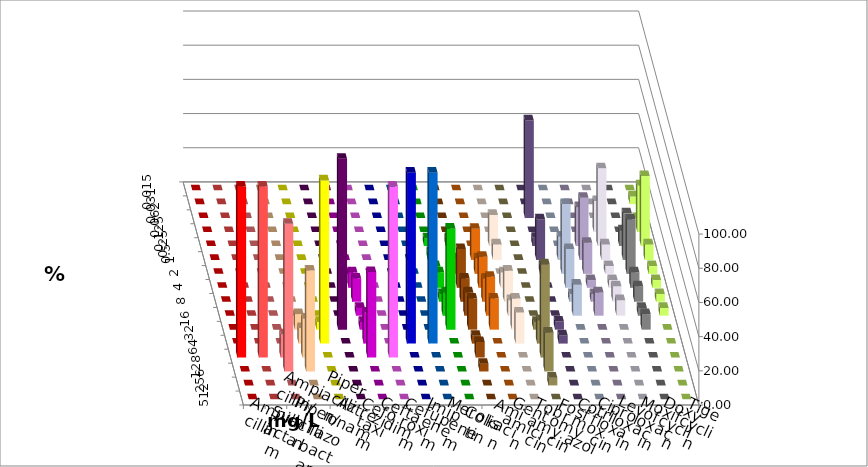
| Category | Ampicillin | Ampicillin/ Sulbactam | Piperacillin | Piperacillin/ Tazobactam | Aztreonam | Cefotaxim | Ceftazidim | Cefuroxim | Imipenem | Meropenem | Colistin | Amikacin | Gentamicin | Tobramycin | Fosfomycin | Cotrimoxazol | Ciprofloxacin | Levofloxacin | Moxifloxacin | Doxycyclin | Tigecyclin |
|---|---|---|---|---|---|---|---|---|---|---|---|---|---|---|---|---|---|---|---|---|---|
| 0.015 | 0 | 0 | 0 | 0 | 0 | 0 | 0 | 0 | 0 | 0 | 0 | 0 | 0 | 0 | 0 | 0 | 0 | 0 | 0 | 0 | 0 |
| 0.031 | 0 | 0 | 0 | 0 | 0 | 0 | 0 | 0 | 0 | 0 | 0 | 0 | 0 | 0 | 0 | 0 | 0 | 0 | 0 | 0 | 4.545 |
| 0.062 | 0 | 0 | 0 | 0 | 0 | 0 | 0 | 0 | 0 | 0 | 0 | 0 | 0 | 0 | 0 | 57.143 | 0 | 0 | 0 | 0 | 0 |
| 0.125 | 0 | 0 | 0 | 0 | 0 | 0 | 0 | 0 | 0 | 0 | 0 | 0 | 0 | 0 | 0 | 0 | 0 | 0 | 18.182 | 0 | 27.273 |
| 0.25 | 0 | 0 | 0 | 0 | 0 | 0 | 0 | 0 | 0 | 0 | 4.545 | 4.545 | 0 | 18.182 | 0 | 4.762 | 0 | 22.727 | 45.455 | 9.091 | 40.909 |
| 0.5 | 0 | 0 | 0 | 0 | 0 | 0 | 0 | 0 | 0 | 0 | 4.545 | 0 | 18.182 | 9.091 | 0 | 23.81 | 13.636 | 36.364 | 9.091 | 27.273 | 9.091 |
| 1.0 | 0 | 0 | 0 | 0 | 0 | 0 | 0 | 0 | 0 | 0 | 4.545 | 9.091 | 9.091 | 0 | 0 | 4.762 | 40.909 | 18.182 | 4.545 | 31.818 | 4.545 |
| 2.0 | 0 | 0 | 0 | 0 | 0 | 0 | 9.091 | 0 | 0 | 0 | 9.091 | 22.727 | 18.182 | 9.091 | 0 | 0 | 22.727 | 4.545 | 4.545 | 9.091 | 4.545 |
| 4.0 | 0 | 0 | 0 | 0 | 0 | 0 | 13.636 | 0 | 0 | 0 | 4.545 | 13.636 | 13.636 | 18.182 | 0 | 0 | 4.545 | 4.545 | 9.091 | 9.091 | 4.545 |
| 8.0 | 0 | 0 | 0 | 0 | 0 | 0 | 4.545 | 0 | 0 | 0 | 13.636 | 13.636 | 22.727 | 9.091 | 0 | 0 | 18.182 | 13.636 | 9.091 | 4.545 | 4.545 |
| 16.0 | 0 | 0 | 0 | 9.091 | 4.545 | 100 | 4.545 | 0 | 0 | 0 | 59.091 | 18.182 | 18.182 | 18.182 | 4.545 | 4.762 | 0 | 0 | 0 | 9.091 | 0 |
| 32.0 | 0 | 0 | 0 | 9.091 | 95.455 | 0 | 18.182 | 0 | 100 | 100 | 0 | 4.545 | 0 | 18.182 | 13.636 | 4.762 | 0 | 0 | 0 | 0 | 0 |
| 64.0 | 100 | 100 | 13.636 | 22.727 | 0 | 0 | 50 | 100 | 0 | 0 | 0 | 9.091 | 0 | 0 | 54.545 | 0 | 0 | 0 | 0 | 0 | 0 |
| 128.0 | 0 | 0 | 86.364 | 59.091 | 0 | 0 | 0 | 0 | 0 | 0 | 0 | 4.545 | 0 | 0 | 22.727 | 0 | 0 | 0 | 0 | 0 | 0 |
| 256.0 | 0 | 0 | 0 | 0 | 0 | 0 | 0 | 0 | 0 | 0 | 0 | 0 | 0 | 0 | 4.545 | 0 | 0 | 0 | 0 | 0 | 0 |
| 512.0 | 0 | 0 | 0 | 0 | 0 | 0 | 0 | 0 | 0 | 0 | 0 | 0 | 0 | 0 | 0 | 0 | 0 | 0 | 0 | 0 | 0 |